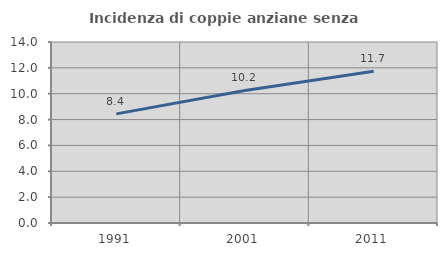
| Category | Incidenza di coppie anziane senza figli  |
|---|---|
| 1991.0 | 8.439 |
| 2001.0 | 10.25 |
| 2011.0 | 11.742 |